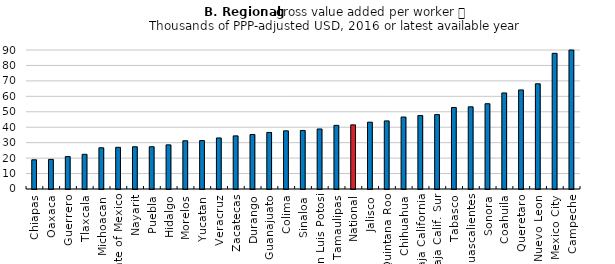
| Category | 2016 or latest available year |
|---|---|
| Chiapas | 18915 |
| Oaxaca | 19170 |
| Guerrero | 20995 |
| Tlaxcala | 22467 |
| Michoacan | 26678 |
| State of Mexico | 26987 |
| Nayarit | 27344 |
| Puebla | 27351 |
| Hidalgo | 28580 |
| Morelos | 31241 |
| Yucatan | 31349 |
| Veracruz | 33042 |
| Zacatecas | 34397 |
| Durango | 35278 |
| Guanajuato | 36617 |
| Colima | 37661 |
| Sinaloa | 37914 |
| San Luis Potosi | 38866 |
| Tamaulipas | 41216 |
| National | 41523 |
| Jalisco | 43262 |
| Quintana Roo | 44089 |
| Chihuahua | 46599 |
| Baja California | 47531 |
| Baja Calif. Sur | 48162 |
| Tabasco | 52786 |
| Aguascalientes | 53210 |
| Sonora | 55208 |
| Coahuila | 62186 |
| Queretaro | 64137 |
| Nuevo Leon | 68123 |
| Mexico City | 87848 |
| Campeche | 117774 |